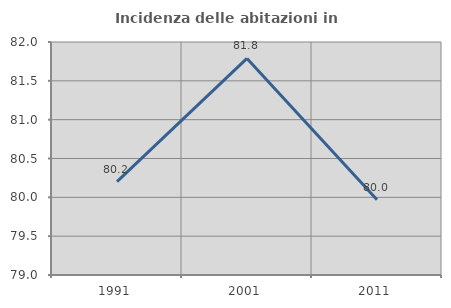
| Category | Incidenza delle abitazioni in proprietà  |
|---|---|
| 1991.0 | 80.201 |
| 2001.0 | 81.788 |
| 2011.0 | 79.969 |